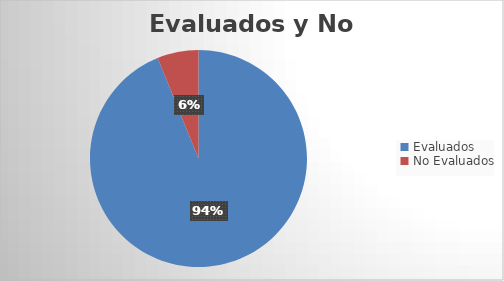
| Category | Series 0 |
|---|---|
| Evaluados | 1589 |
| No Evaluados | 104 |